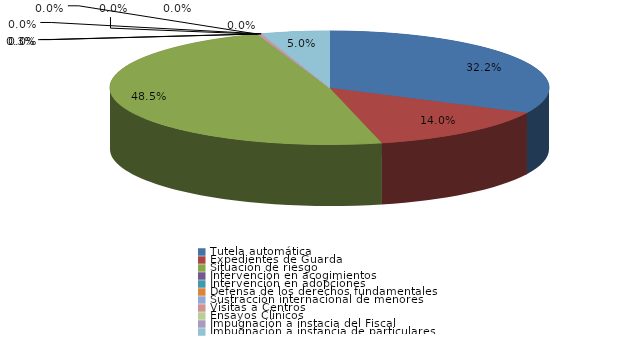
| Category | Series 0 |
|---|---|
| Tutela automática | 224 |
| Expedientes de Guarda | 97 |
| Situación de riesgo | 337 |
| Intervención en acogimientos | 0 |
| Intervención en adopciones | 0 |
| Defensa de los derechos fundamentales | 0 |
| Sustracción internacional de menores | 0 |
| Visitas a Centros | 2 |
| Ensayos Clínicos | 0 |
| Impugnación a instacia del Fiscal | 0 |
| Impugnación a instancia de particulares | 35 |